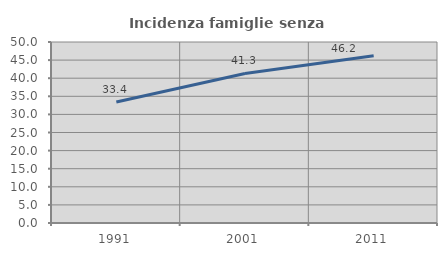
| Category | Incidenza famiglie senza nuclei |
|---|---|
| 1991.0 | 33.415 |
| 2001.0 | 41.3 |
| 2011.0 | 46.228 |